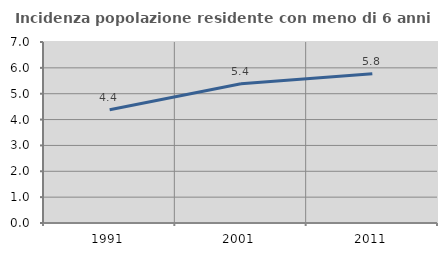
| Category | Incidenza popolazione residente con meno di 6 anni |
|---|---|
| 1991.0 | 4.378 |
| 2001.0 | 5.382 |
| 2011.0 | 5.772 |